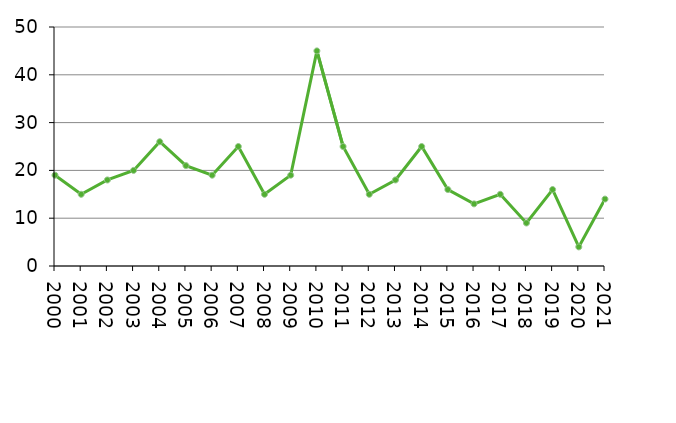
| Category | Avlidna |
|---|---|
| 2000 | 19 |
| 2001 | 15 |
| 2002 | 18 |
| 2003 | 20 |
| 2004 | 26 |
| 2005 | 21 |
| 2006 | 19 |
| 2007 | 25 |
| 2008 | 15 |
| 2009 | 19 |
| 2010 | 45 |
| 2011 | 25 |
| 2012 | 15 |
| 2013 | 18 |
| 2014 | 25 |
| 2015 | 16 |
| 2016 | 13 |
| 2017 | 15 |
| 2018 | 9 |
| 2019 | 16 |
| 2020 | 4 |
| 2021 | 14 |